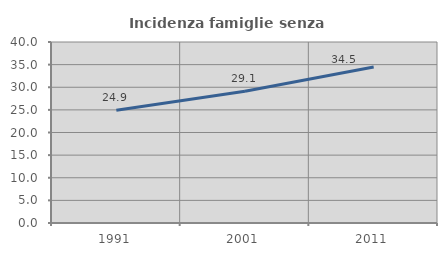
| Category | Incidenza famiglie senza nuclei |
|---|---|
| 1991.0 | 24.941 |
| 2001.0 | 29.111 |
| 2011.0 | 34.493 |